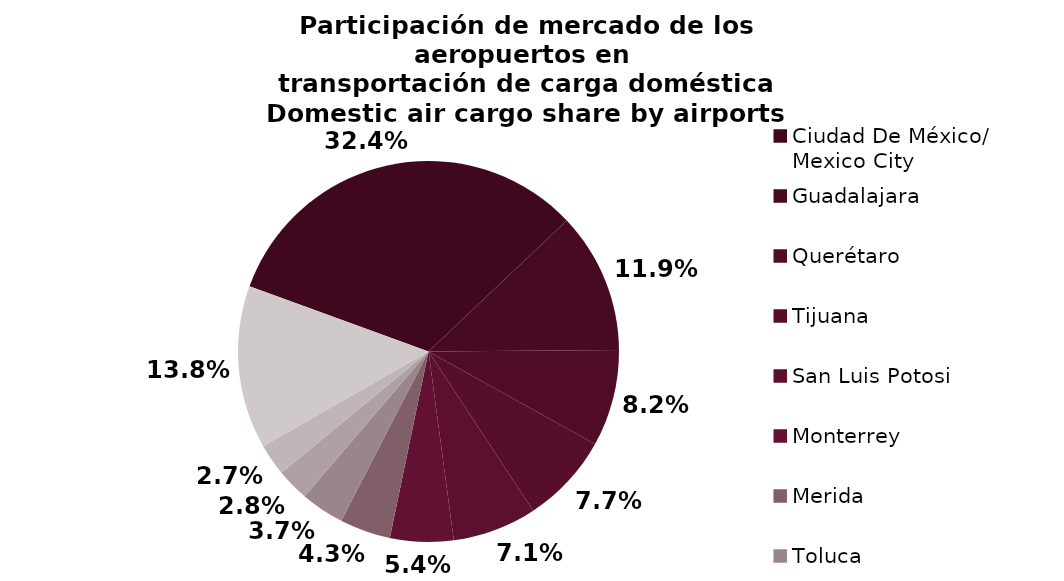
| Category | Series 0 |
|---|---|
| Ciudad De México/
Mexico City | 9371.84 |
| Guadalajara | 3455.835 |
| Querétaro | 2374.794 |
| Tijuana | 2221.305 |
| San Luis Potosi | 2065.66 |
| Monterrey | 1557.341 |
| Merida | 1249.644 |
| Toluca | 1070.505 |
| Cancun | 798.891 |
| Hermosillo | 780.121 |
| Otros/Others | 4004.109 |